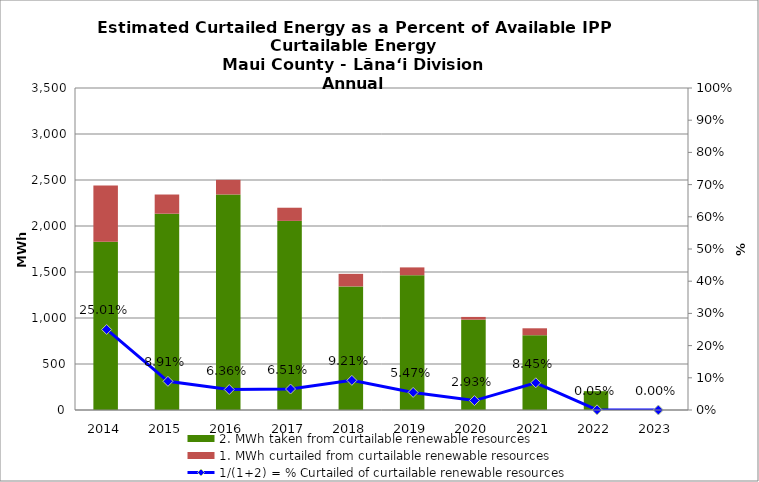
| Category | 2. MWh taken from curtailable renewable resources | 1. MWh curtailed from curtailable renewable resources |
|---|---|---|
| 2014.0 | 1830 | 610.3 |
| 2015.0 | 2133.594 | 208.64 |
| 2016.0 | 2342.63 | 159.14 |
| 2017.0 | 2055.52 | 143.131 |
| 2018.0 | 1343.558 | 136.336 |
| 2019.0 | 1465.267 | 84.749 |
| 2020.0 | 981.989 | 29.616 |
| 2021.0 | 813.084 | 75.027 |
| 2022.0 | 204.622 | 0.099 |
| 2023.0 | 0 | 0 |